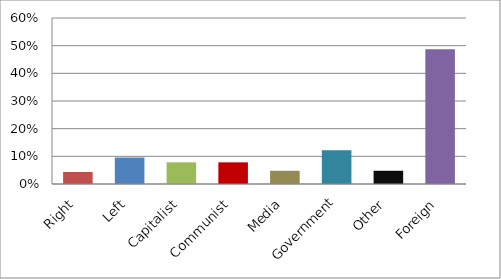
| Category | Series 0 |
|---|---|
| Right | 0.043 |
| Left | 0.096 |
| Capitalist | 0.078 |
| Communist | 0.078 |
| Media | 0.048 |
| Government | 0.122 |
| Other | 0.048 |
| Foreign | 0.487 |